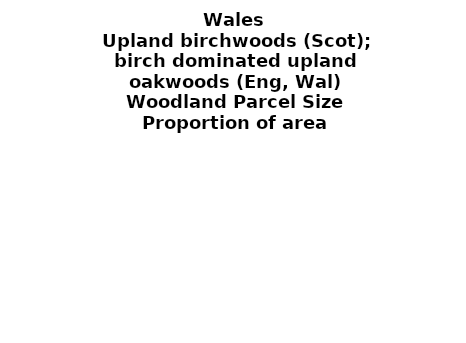
| Category | Upland birchwoods (Scot); birch dominated upland oakwoods (Eng, Wal) |
|---|---|
| <5 ha | 0.078 |
| ≥5 and <10 ha | 0.026 |
| ≥10 and <15 ha | 0.046 |
| ≥15 and <20 ha | 0.081 |
| ≥20 and <25 ha | 0 |
| ≥25 and <30 ha | 0 |
| ≥30 and <35 ha | 0 |
| ≥35 and <40 ha | 0 |
| ≥40 and <45 ha | 0 |
| ≥45 and <50 ha | 0.032 |
| ≥50 and <60 ha | 0.074 |
| ≥60 and <70 ha | 0.073 |
| ≥70 and <80 ha | 0 |
| ≥80 and <90 ha | 0.004 |
| ≥90 and <100 ha | 0.011 |
| ≥100 and <150 ha | 0.235 |
| ≥150 and <200 ha | 0 |
| ≥200 ha | 0.341 |